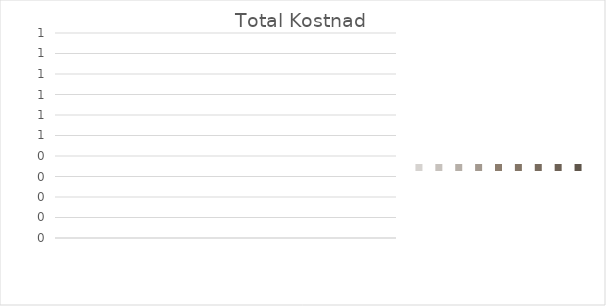
| Category | Series 0 | Series 1 | Series 2 | Series 3 | Series 4 | Series 5 | Series 6 | Series 7 | Series 8 |
|---|---|---|---|---|---|---|---|---|---|
| 0 | 0 | 0 | 0 | 0 | 0 | 0 | 0 | 0 | 0 |
| 1 | 0 | 0 | 0 | 0 | 0 | 0 | 0 | 0 | 0 |
| 2 | 0 | 0 | 0 | 0 | 0 | 0 | 0 | 0 | 0 |
| 3 | 0 | 0 | 0 | 0 | 0 | 0 | 0 | 0 | 0 |
| 4 | 0 | 0 | 0 | 0 | 0 | 0 | 0 | 0 | 0 |
| 5 | 0 | 0 | 0 | 0 | 0 | 0 | 0 | 0 | 0 |
| 6 | 0 | 0 | 0 | 0 | 0 | 0 | 0 | 0 | 0 |
| 7 | 0 | 0 | 0 | 0 | 0 | 0 | 0 | 0 | 0 |